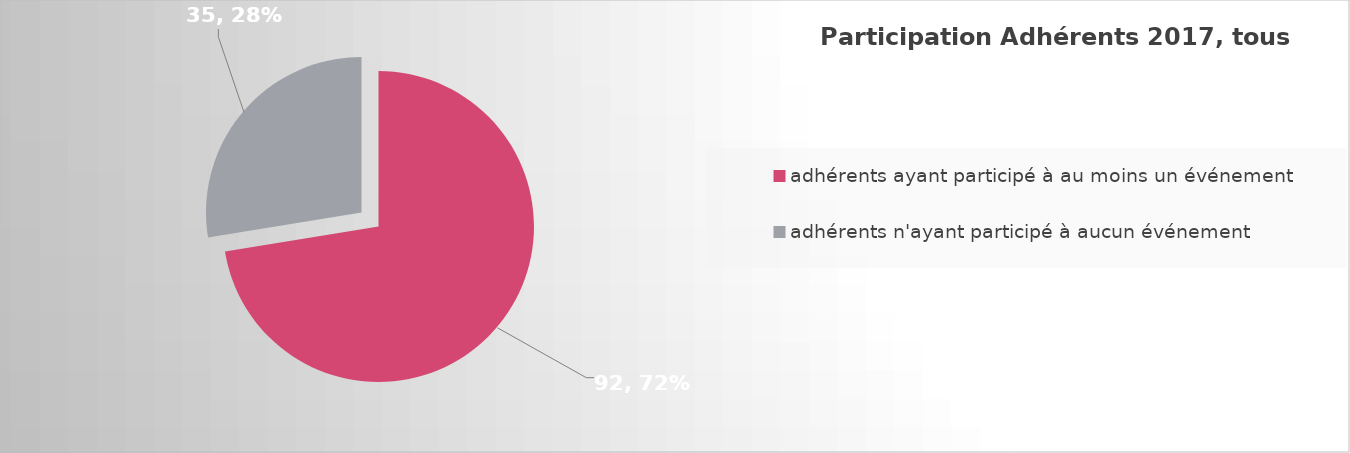
| Category | Series 0 |
|---|---|
| adhérents ayant participé à au moins un événement | 92 |
| adhérents n'ayant participé à aucun événement | 35 |